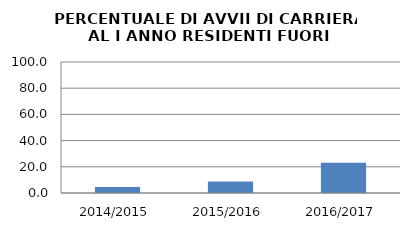
| Category | 2014/2015 2015/2016 2016/2017 |
|---|---|
| 2014/2015 | 4.545 |
| 2015/2016 | 8.696 |
| 2016/2017 | 23.077 |